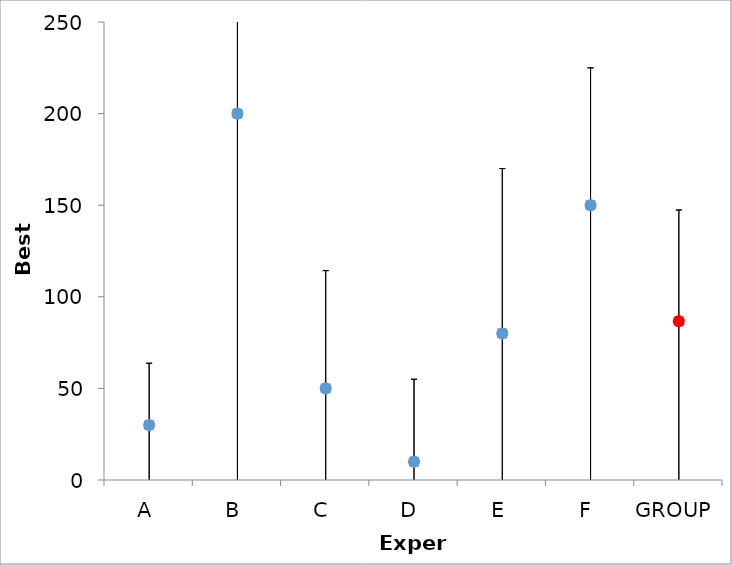
| Category | Series 1 | Series 0 |
|---|---|---|
| A | 30 | 30 |
| B | 200 | 200 |
| C | 50 | 50 |
| D | 10 | 10 |
| E | 80 | 80 |
| F | 150 | 150 |
| GROUP | 86.667 | 86.667 |